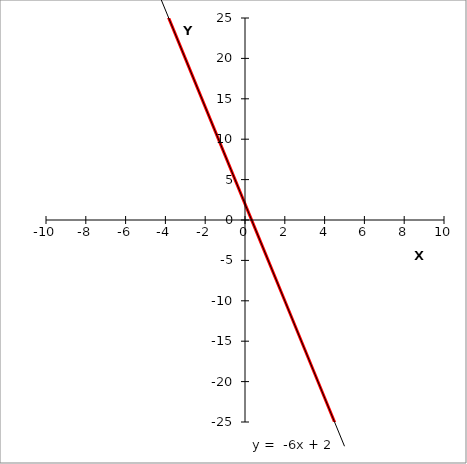
| Category | y |
|---|---|
| -5.0 | 32 |
| -4.0 | 26 |
| -3.0 | 20 |
| -2.0 | 14 |
| -1.0 | 8 |
| 0.0 | 2 |
| 1.0 | -4 |
| 2.0 | -10 |
| 3.0 | -16 |
| 4.0 | -22 |
| 5.0 | -28 |